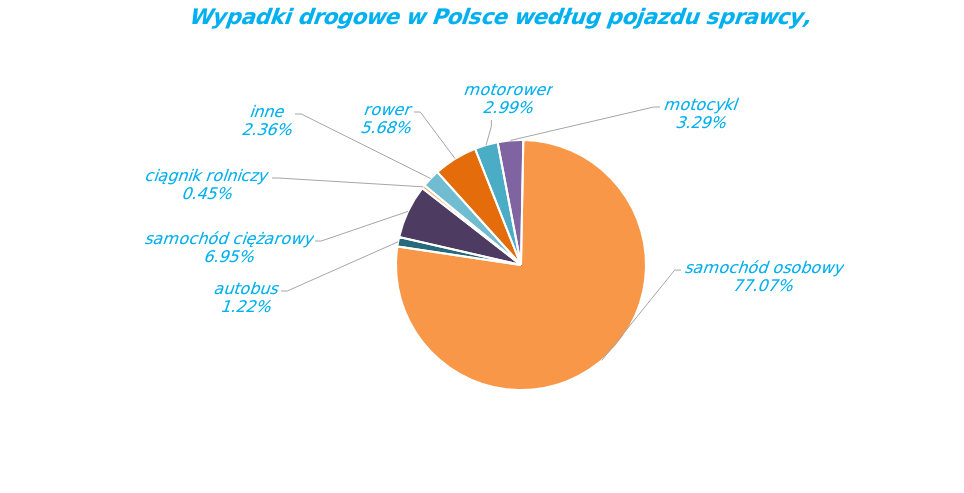
| Category | Series 0 |
|---|---|
| rower | 1714 |
| motorower | 903 |
| motocykl | 994 |
| samochód osobowy | 23265 |
| autobus | 367 |
| samochód ciężarowy | 2096 |
| ciągnik rolniczy | 136 |
| inne | 711 |